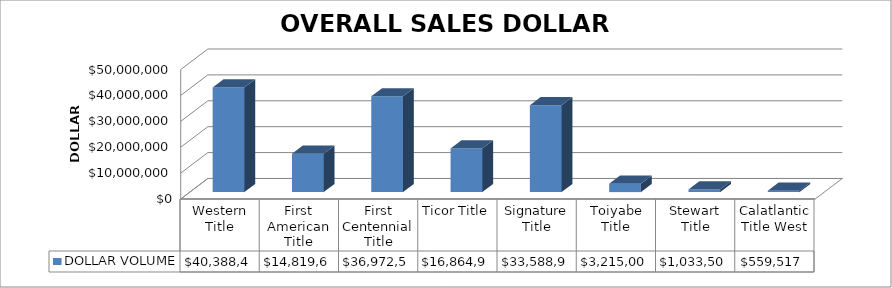
| Category | DOLLAR VOLUME |
|---|---|
| Western Title | 40388490 |
| First American Title | 14819650 |
| First Centennial Title | 36972500 |
| Ticor Title | 16864939.04 |
| Signature Title | 33588908 |
| Toiyabe Title | 3215000 |
| Stewart Title | 1033500 |
| Calatlantic Title West | 559517 |